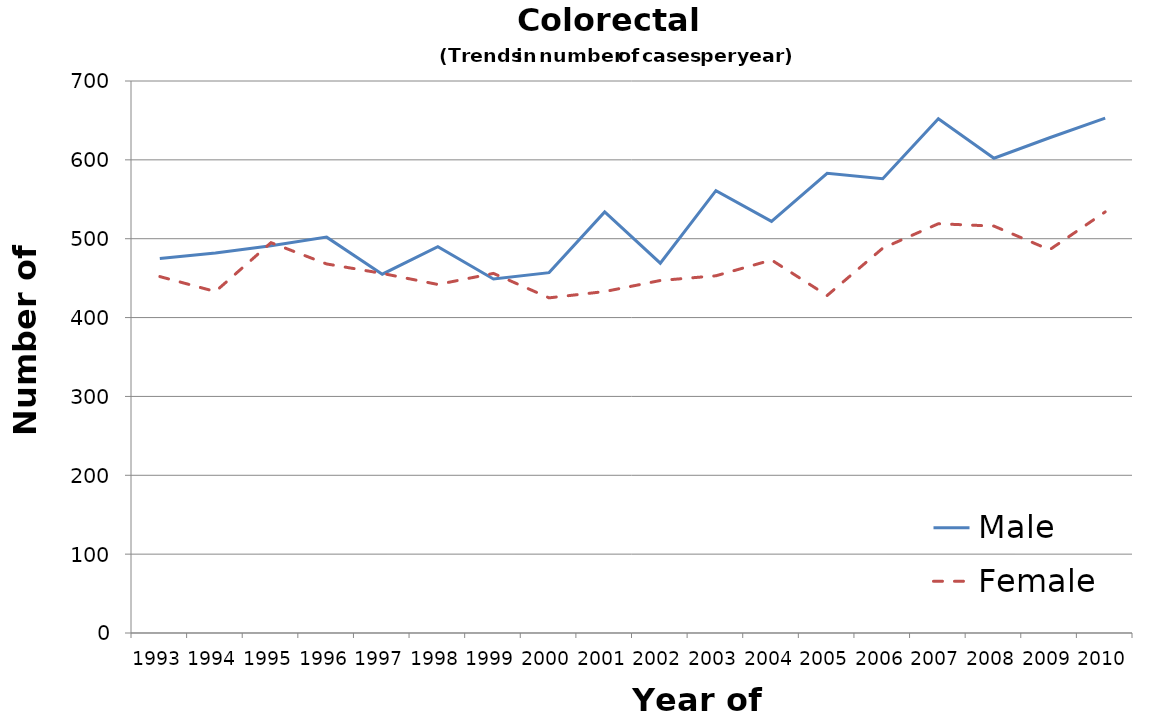
| Category | Male | Female |
|---|---|---|
| 1993.0 | 475 | 452 |
| 1994.0 | 482 | 433 |
| 1995.0 | 491 | 495 |
| 1996.0 | 502 | 468 |
| 1997.0 | 455 | 456 |
| 1998.0 | 490 | 442 |
| 1999.0 | 449 | 456 |
| 2000.0 | 457 | 425 |
| 2001.0 | 534 | 433 |
| 2002.0 | 469 | 447 |
| 2003.0 | 561 | 453 |
| 2004.0 | 522 | 473 |
| 2005.0 | 583 | 428 |
| 2006.0 | 576 | 488 |
| 2007.0 | 652 | 519 |
| 2008.0 | 602 | 516 |
| 2009.0 | 628 | 486 |
| 2010.0 | 653 | 534 |